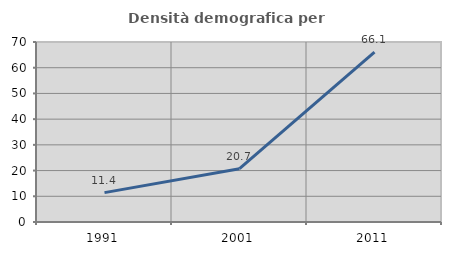
| Category | Densità demografica |
|---|---|
| 1991.0 | 11.426 |
| 2001.0 | 20.716 |
| 2011.0 | 66.099 |